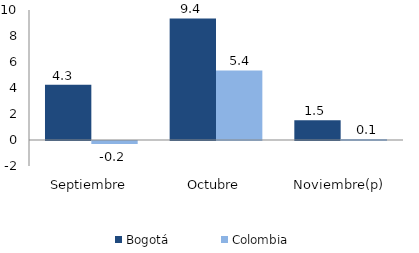
| Category | Bogotá | Colombia |
|---|---|---|
| Septiembre | 4.258 | -0.237 |
| Octubre | 9.351 | 5.356 |
| Noviembre(p) | 1.511 | 0.071 |